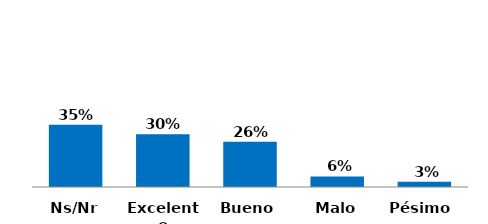
| Category | Series 0 |
|---|---|
| Pésimo  | 0.03 |
| Malo | 0.06 |
| Bueno | 0.257 |
| Excelente | 0.3 |
| Ns/Nr | 0.353 |